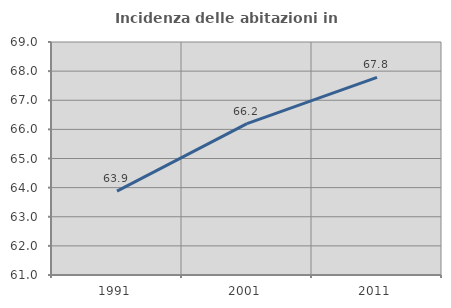
| Category | Incidenza delle abitazioni in proprietà  |
|---|---|
| 1991.0 | 63.881 |
| 2001.0 | 66.197 |
| 2011.0 | 67.787 |